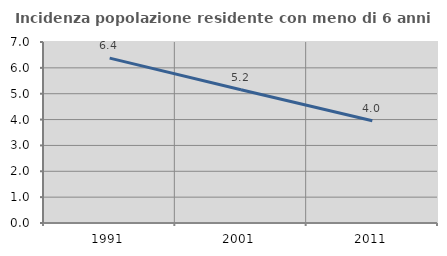
| Category | Incidenza popolazione residente con meno di 6 anni |
|---|---|
| 1991.0 | 6.376 |
| 2001.0 | 5.156 |
| 2011.0 | 3.953 |